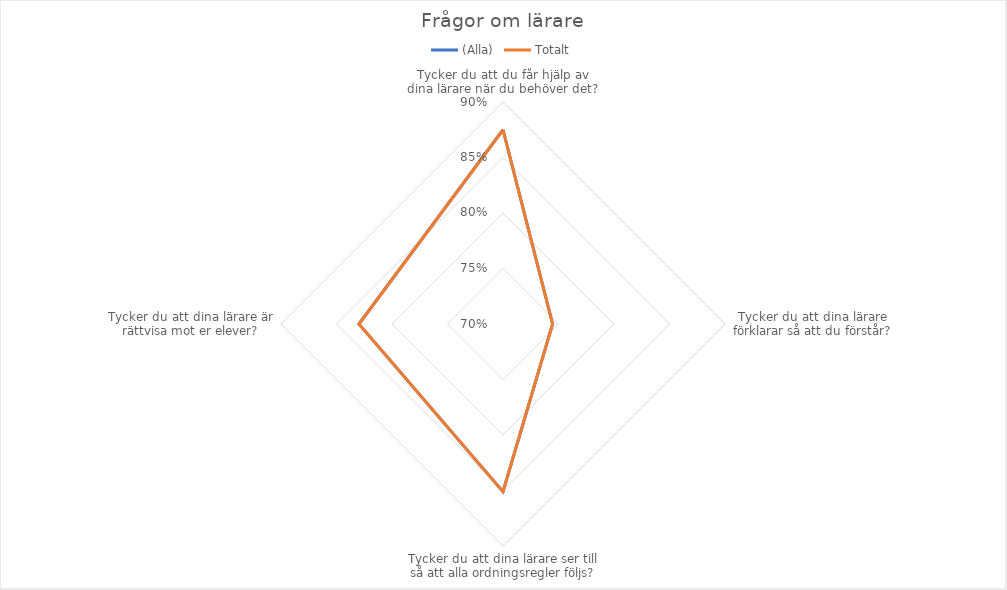
| Category | (Alla) | Totalt |
|---|---|---|
| Tycker du att du får hjälp av dina lärare när du behöver det? | 0.875 | 0.875 |
| Tycker du att dina lärare förklarar så att du förstår? | 0.745 | 0.745 |
| Tycker du att dina lärare ser till så att alla ordningsregler följs? | 0.851 | 0.851 |
| Tycker du att dina lärare är rättvisa mot er elever? | 0.83 | 0.83 |